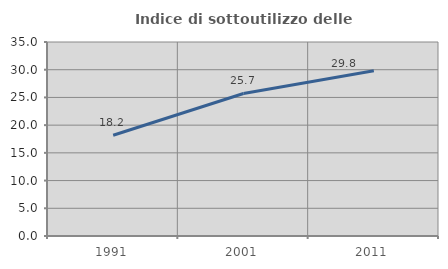
| Category | Indice di sottoutilizzo delle abitazioni  |
|---|---|
| 1991.0 | 18.167 |
| 2001.0 | 25.718 |
| 2011.0 | 29.809 |